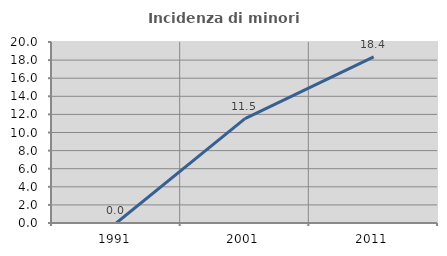
| Category | Incidenza di minori stranieri |
|---|---|
| 1991.0 | 0 |
| 2001.0 | 11.538 |
| 2011.0 | 18.367 |